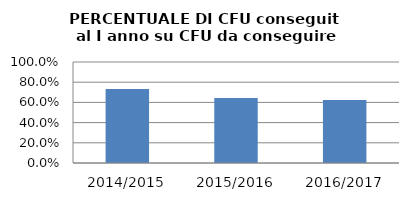
| Category | 2014/2015 2015/2016 2016/2017 |
|---|---|
| 2014/2015 | 0.732 |
| 2015/2016 | 0.643 |
| 2016/2017 | 0.623 |